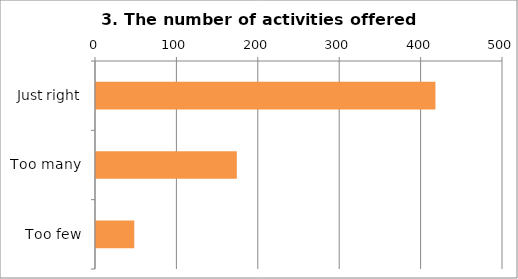
| Category | 3. The number of activities offered was . . . |
|---|---|
| Just right | 417 |
| Too many | 173 |
| Too few | 47 |